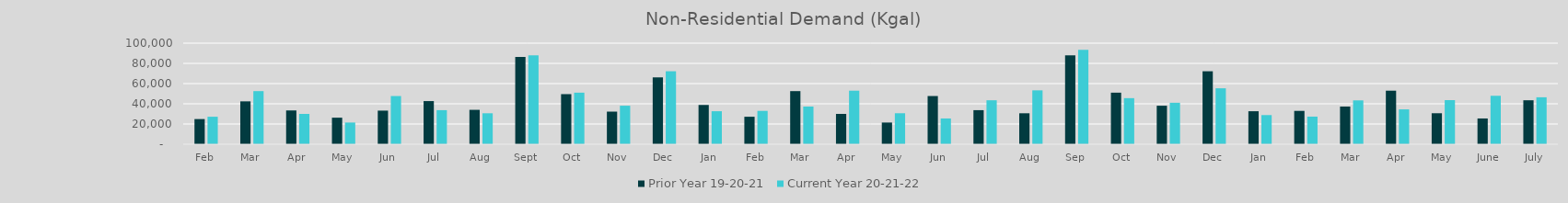
| Category | Prior Year 19-20-21 | Current Year 20-21-22 |
|---|---|---|
| Feb | 24891.705 | 27184.287 |
| Mar | 42416.796 | 52556.784 |
| Apr | 33427.881 | 30008.586 |
| May | 26254.448 | 21459.484 |
| Jun | 33248.873 | 47687.401 |
| Jul | 42679.938 | 33702.696 |
| Aug | 34036.498 | 30630.765 |
| Sep | 86367.775 | 87939.966 |
| Oct | 49561.754 | 51017.647 |
| Nov | 32261.42 | 38090.247 |
| Dec | 66164.871 | 72201.815 |
| Jan | 38851.995 | 32645.301 |
| Feb | 27184.287 | 32987.653 |
| Mar | 52556.784 | 37296.185 |
| Apr | 30008.586 | 52983.593 |
| May | 21459.484 | 30657.737 |
| Jun | 47687.401 | 25485.258 |
| Jul | 33702.696 | 43493.567 |
| Aug | 30630.765 | 53305.831 |
| Sep | 87939.966 | 93442.494 |
| Oct | 51017.647 | 45586.98 |
| Nov | 38090.247 | 41019.482 |
| Dec | 72201.815 | 55350.474 |
| Jan | 32645.301 | 28832.602 |
| Feb | 32987.653 | 27305.762 |
| Mar | 37296.185 | 43384.037 |
| Apr | 52983.593 | 34485.291 |
| May | 30657.737 | 43618.865 |
| June | 25485.258 | 47925.22 |
| July | 43493.567 | 46450.441 |